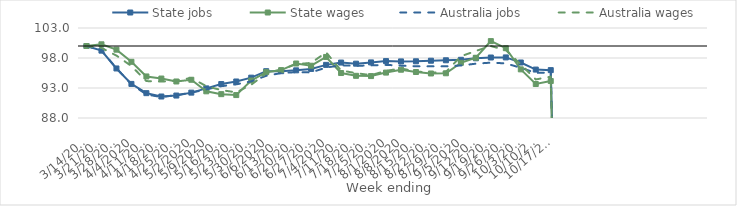
| Category | State jobs | State wages | Australia jobs | Australia wages |
|---|---|---|---|---|
| 14/03/2020 | 100 | 100 | 100 | 100 |
| 21/03/2020 | 99.229 | 100.282 | 99.265 | 99.682 |
| 28/03/2020 | 96.256 | 99.388 | 96.284 | 98.406 |
| 04/04/2020 | 93.682 | 97.366 | 93.626 | 96.656 |
| 11/04/2020 | 92.14 | 94.924 | 91.924 | 94.154 |
| 18/04/2020 | 91.581 | 94.577 | 91.482 | 94.062 |
| 25/04/2020 | 91.744 | 94.087 | 91.821 | 94.245 |
| 02/05/2020 | 92.229 | 94.373 | 92.221 | 94.677 |
| 09/05/2020 | 92.935 | 92.446 | 92.772 | 93.304 |
| 16/05/2020 | 93.66 | 91.975 | 93.305 | 92.652 |
| 23/05/2020 | 94.085 | 91.822 | 93.609 | 92.272 |
| 30/05/2020 | 94.725 | 94.248 | 94.11 | 93.544 |
| 06/06/2020 | 95.801 | 95.642 | 95.034 | 95.442 |
| 13/06/2020 | 95.8 | 95.985 | 95.487 | 96.076 |
| 20/06/2020 | 95.945 | 97.083 | 95.645 | 96.966 |
| 27/06/2020 | 96.179 | 96.716 | 95.594 | 97.186 |
| 04/07/2020 | 96.856 | 98.175 | 96.409 | 98.934 |
| 11/07/2020 | 97.241 | 95.496 | 96.784 | 95.92 |
| 18/07/2020 | 97.053 | 95.029 | 96.696 | 95.473 |
| 25/07/2020 | 97.267 | 94.987 | 96.767 | 95.143 |
| 01/08/2020 | 97.484 | 95.568 | 96.854 | 95.856 |
| 08/08/2020 | 97.43 | 96.046 | 96.728 | 96.257 |
| 15/08/2020 | 97.451 | 95.666 | 96.62 | 95.754 |
| 22/08/2020 | 97.548 | 95.421 | 96.624 | 95.563 |
| 29/08/2020 | 97.62 | 95.453 | 96.609 | 95.684 |
| 05/09/2020 | 97.699 | 97.198 | 96.751 | 98.286 |
| 12/09/2020 | 97.953 | 98.041 | 97.054 | 99.176 |
| 19/09/2020 | 98.082 | 100.817 | 97.226 | 99.992 |
| 26/09/2020 | 98.097 | 99.63 | 97.1 | 99.309 |
| 03/10/2020 | 97.252 | 96.106 | 96.368 | 96.936 |
| 10/10/2020 | 96.071 | 93.665 | 95.514 | 94.424 |
| 17/10/2020 | 95.978 | 94.162 | 95.573 | 94.889 |